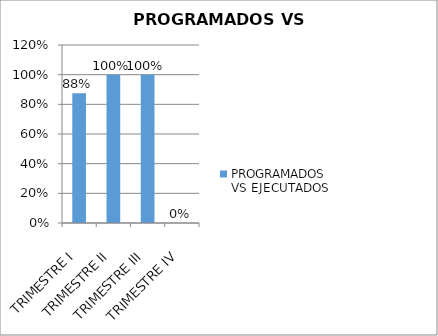
| Category | PROGRAMADOS VS EJECUTADOS |
|---|---|
| TRIMESTRE I | 0.875 |
| TRIMESTRE II | 1 |
| TRIMESTRE III | 1 |
| TRIMESTRE IV | 0 |